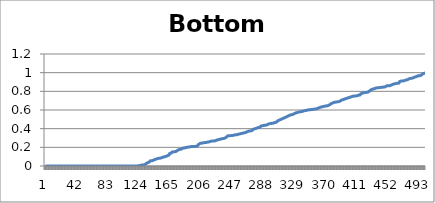
| Category | Bottom Slice |
|---|---|
| 0 | 0 |
| 1 | 0 |
| 2 | 0 |
| 3 | 0 |
| 4 | 0 |
| 5 | 0 |
| 6 | 0 |
| 7 | 0 |
| 8 | 0 |
| 9 | 0 |
| 10 | 0 |
| 11 | 0 |
| 12 | 0 |
| 13 | 0 |
| 14 | 0 |
| 15 | 0 |
| 16 | 0 |
| 17 | 0 |
| 18 | 0 |
| 19 | 0 |
| 20 | 0 |
| 21 | 0 |
| 22 | 0 |
| 23 | 0 |
| 24 | 0 |
| 25 | 0 |
| 26 | 0 |
| 27 | 0 |
| 28 | 0 |
| 29 | 0 |
| 30 | 0 |
| 31 | 0 |
| 32 | 0 |
| 33 | 0 |
| 34 | 0 |
| 35 | 0 |
| 36 | 0 |
| 37 | 0 |
| 38 | 0 |
| 39 | 0 |
| 40 | 0 |
| 41 | 0 |
| 42 | 0 |
| 43 | 0 |
| 44 | 0 |
| 45 | 0 |
| 46 | 0 |
| 47 | 0 |
| 48 | 0 |
| 49 | 0 |
| 50 | 0 |
| 51 | 0 |
| 52 | 0 |
| 53 | 0 |
| 54 | 0 |
| 55 | 0 |
| 56 | 0 |
| 57 | 0 |
| 58 | 0 |
| 59 | 0 |
| 60 | 0 |
| 61 | 0 |
| 62 | 0 |
| 63 | 0 |
| 64 | 0 |
| 65 | 0 |
| 66 | 0 |
| 67 | 0 |
| 68 | 0 |
| 69 | 0 |
| 70 | 0 |
| 71 | 0 |
| 72 | 0 |
| 73 | 0 |
| 74 | 0 |
| 75 | 0 |
| 76 | 0 |
| 77 | 0 |
| 78 | 0 |
| 79 | 0 |
| 80 | 0 |
| 81 | 0 |
| 82 | 0 |
| 83 | 0 |
| 84 | 0 |
| 85 | 0 |
| 86 | 0 |
| 87 | 0 |
| 88 | 0 |
| 89 | 0 |
| 90 | 0 |
| 91 | 0 |
| 92 | 0 |
| 93 | 0 |
| 94 | 0 |
| 95 | 0 |
| 96 | 0 |
| 97 | 0 |
| 98 | 0 |
| 99 | 0 |
| 100 | 0 |
| 101 | 0 |
| 102 | 0 |
| 103 | 0 |
| 104 | 0 |
| 105 | 0 |
| 106 | 0 |
| 107 | 0 |
| 108 | 0 |
| 109 | 0 |
| 110 | 0 |
| 111 | 0 |
| 112 | 0 |
| 113 | 0 |
| 114 | 0 |
| 115 | 0 |
| 116 | 0 |
| 117 | 0 |
| 118 | 0 |
| 119 | 0 |
| 120 | 0 |
| 121 | 0 |
| 122 | 0.002 |
| 123 | 0.004 |
| 124 | 0.005 |
| 125 | 0.007 |
| 126 | 0.01 |
| 127 | 0.01 |
| 128 | 0.01 |
| 129 | 0.012 |
| 130 | 0.014 |
| 131 | 0.019 |
| 132 | 0.024 |
| 133 | 0.033 |
| 134 | 0.035 |
| 135 | 0.038 |
| 136 | 0.041 |
| 137 | 0.043 |
| 138 | 0.056 |
| 139 | 0.056 |
| 140 | 0.056 |
| 141 | 0.059 |
| 142 | 0.062 |
| 143 | 0.07 |
| 144 | 0.071 |
| 145 | 0.074 |
| 146 | 0.076 |
| 147 | 0.079 |
| 148 | 0.082 |
| 149 | 0.082 |
| 150 | 0.083 |
| 151 | 0.085 |
| 152 | 0.087 |
| 153 | 0.091 |
| 154 | 0.095 |
| 155 | 0.096 |
| 156 | 0.098 |
| 157 | 0.1 |
| 158 | 0.102 |
| 159 | 0.106 |
| 160 | 0.11 |
| 161 | 0.116 |
| 162 | 0.116 |
| 163 | 0.133 |
| 164 | 0.135 |
| 165 | 0.137 |
| 166 | 0.149 |
| 167 | 0.15 |
| 168 | 0.151 |
| 169 | 0.152 |
| 170 | 0.153 |
| 171 | 0.155 |
| 172 | 0.158 |
| 173 | 0.166 |
| 174 | 0.17 |
| 175 | 0.177 |
| 176 | 0.178 |
| 177 | 0.179 |
| 178 | 0.179 |
| 179 | 0.189 |
| 180 | 0.19 |
| 181 | 0.191 |
| 182 | 0.193 |
| 183 | 0.196 |
| 184 | 0.196 |
| 185 | 0.198 |
| 186 | 0.201 |
| 187 | 0.203 |
| 188 | 0.203 |
| 189 | 0.204 |
| 190 | 0.205 |
| 191 | 0.207 |
| 192 | 0.209 |
| 193 | 0.209 |
| 194 | 0.21 |
| 195 | 0.21 |
| 196 | 0.21 |
| 197 | 0.21 |
| 198 | 0.211 |
| 199 | 0.219 |
| 200 | 0.219 |
| 201 | 0.231 |
| 202 | 0.231 |
| 203 | 0.242 |
| 204 | 0.243 |
| 205 | 0.245 |
| 206 | 0.246 |
| 207 | 0.248 |
| 208 | 0.248 |
| 209 | 0.25 |
| 210 | 0.251 |
| 211 | 0.252 |
| 212 | 0.254 |
| 213 | 0.257 |
| 214 | 0.258 |
| 215 | 0.259 |
| 216 | 0.263 |
| 217 | 0.265 |
| 218 | 0.267 |
| 219 | 0.268 |
| 220 | 0.268 |
| 221 | 0.269 |
| 222 | 0.269 |
| 223 | 0.27 |
| 224 | 0.275 |
| 225 | 0.278 |
| 226 | 0.281 |
| 227 | 0.282 |
| 228 | 0.283 |
| 229 | 0.286 |
| 230 | 0.29 |
| 231 | 0.291 |
| 232 | 0.294 |
| 233 | 0.294 |
| 234 | 0.296 |
| 235 | 0.297 |
| 236 | 0.301 |
| 237 | 0.306 |
| 238 | 0.31 |
| 239 | 0.322 |
| 240 | 0.323 |
| 241 | 0.325 |
| 242 | 0.325 |
| 243 | 0.325 |
| 244 | 0.326 |
| 245 | 0.327 |
| 246 | 0.329 |
| 247 | 0.329 |
| 248 | 0.332 |
| 249 | 0.334 |
| 250 | 0.334 |
| 251 | 0.334 |
| 252 | 0.335 |
| 253 | 0.34 |
| 254 | 0.342 |
| 255 | 0.344 |
| 256 | 0.344 |
| 257 | 0.348 |
| 258 | 0.351 |
| 259 | 0.351 |
| 260 | 0.352 |
| 261 | 0.356 |
| 262 | 0.357 |
| 263 | 0.359 |
| 264 | 0.364 |
| 265 | 0.368 |
| 266 | 0.368 |
| 267 | 0.375 |
| 268 | 0.375 |
| 269 | 0.376 |
| 270 | 0.379 |
| 271 | 0.379 |
| 272 | 0.381 |
| 273 | 0.394 |
| 274 | 0.398 |
| 275 | 0.399 |
| 276 | 0.401 |
| 277 | 0.404 |
| 278 | 0.411 |
| 279 | 0.412 |
| 280 | 0.413 |
| 281 | 0.414 |
| 282 | 0.415 |
| 283 | 0.429 |
| 284 | 0.43 |
| 285 | 0.431 |
| 286 | 0.435 |
| 287 | 0.435 |
| 288 | 0.436 |
| 289 | 0.437 |
| 290 | 0.438 |
| 291 | 0.442 |
| 292 | 0.448 |
| 293 | 0.45 |
| 294 | 0.451 |
| 295 | 0.454 |
| 296 | 0.455 |
| 297 | 0.457 |
| 298 | 0.457 |
| 299 | 0.459 |
| 300 | 0.466 |
| 301 | 0.467 |
| 302 | 0.467 |
| 303 | 0.468 |
| 304 | 0.477 |
| 305 | 0.484 |
| 306 | 0.489 |
| 307 | 0.492 |
| 308 | 0.493 |
| 309 | 0.499 |
| 310 | 0.504 |
| 311 | 0.507 |
| 312 | 0.509 |
| 313 | 0.515 |
| 314 | 0.517 |
| 315 | 0.521 |
| 316 | 0.525 |
| 317 | 0.529 |
| 318 | 0.529 |
| 319 | 0.537 |
| 320 | 0.538 |
| 321 | 0.546 |
| 322 | 0.546 |
| 323 | 0.549 |
| 324 | 0.55 |
| 325 | 0.554 |
| 326 | 0.561 |
| 327 | 0.563 |
| 328 | 0.568 |
| 329 | 0.57 |
| 330 | 0.57 |
| 331 | 0.574 |
| 332 | 0.578 |
| 333 | 0.579 |
| 334 | 0.581 |
| 335 | 0.582 |
| 336 | 0.584 |
| 337 | 0.584 |
| 338 | 0.586 |
| 339 | 0.59 |
| 340 | 0.592 |
| 341 | 0.594 |
| 342 | 0.594 |
| 343 | 0.596 |
| 344 | 0.6 |
| 345 | 0.601 |
| 346 | 0.602 |
| 347 | 0.602 |
| 348 | 0.603 |
| 349 | 0.605 |
| 350 | 0.606 |
| 351 | 0.607 |
| 352 | 0.607 |
| 353 | 0.61 |
| 354 | 0.61 |
| 355 | 0.61 |
| 356 | 0.612 |
| 357 | 0.617 |
| 358 | 0.618 |
| 359 | 0.623 |
| 360 | 0.628 |
| 361 | 0.63 |
| 362 | 0.633 |
| 363 | 0.634 |
| 364 | 0.636 |
| 365 | 0.637 |
| 366 | 0.64 |
| 367 | 0.642 |
| 368 | 0.644 |
| 369 | 0.644 |
| 370 | 0.648 |
| 371 | 0.648 |
| 372 | 0.649 |
| 373 | 0.655 |
| 374 | 0.658 |
| 375 | 0.668 |
| 376 | 0.673 |
| 377 | 0.675 |
| 378 | 0.676 |
| 379 | 0.683 |
| 380 | 0.684 |
| 381 | 0.684 |
| 382 | 0.686 |
| 383 | 0.688 |
| 384 | 0.688 |
| 385 | 0.69 |
| 386 | 0.695 |
| 387 | 0.696 |
| 388 | 0.7 |
| 389 | 0.708 |
| 390 | 0.71 |
| 391 | 0.711 |
| 392 | 0.713 |
| 393 | 0.719 |
| 394 | 0.722 |
| 395 | 0.723 |
| 396 | 0.723 |
| 397 | 0.731 |
| 398 | 0.733 |
| 399 | 0.734 |
| 400 | 0.735 |
| 401 | 0.74 |
| 402 | 0.742 |
| 403 | 0.746 |
| 404 | 0.747 |
| 405 | 0.75 |
| 406 | 0.75 |
| 407 | 0.751 |
| 408 | 0.752 |
| 409 | 0.752 |
| 410 | 0.755 |
| 411 | 0.759 |
| 412 | 0.761 |
| 413 | 0.762 |
| 414 | 0.774 |
| 415 | 0.774 |
| 416 | 0.781 |
| 417 | 0.784 |
| 418 | 0.785 |
| 419 | 0.787 |
| 420 | 0.787 |
| 421 | 0.788 |
| 422 | 0.79 |
| 423 | 0.792 |
| 424 | 0.794 |
| 425 | 0.795 |
| 426 | 0.808 |
| 427 | 0.815 |
| 428 | 0.819 |
| 429 | 0.822 |
| 430 | 0.825 |
| 431 | 0.825 |
| 432 | 0.829 |
| 433 | 0.831 |
| 434 | 0.837 |
| 435 | 0.837 |
| 436 | 0.838 |
| 437 | 0.839 |
| 438 | 0.84 |
| 439 | 0.841 |
| 440 | 0.841 |
| 441 | 0.844 |
| 442 | 0.844 |
| 443 | 0.844 |
| 444 | 0.845 |
| 445 | 0.847 |
| 446 | 0.849 |
| 447 | 0.851 |
| 448 | 0.859 |
| 449 | 0.859 |
| 450 | 0.86 |
| 451 | 0.86 |
| 452 | 0.861 |
| 453 | 0.868 |
| 454 | 0.868 |
| 455 | 0.869 |
| 456 | 0.875 |
| 457 | 0.879 |
| 458 | 0.88 |
| 459 | 0.882 |
| 460 | 0.884 |
| 461 | 0.887 |
| 462 | 0.887 |
| 463 | 0.887 |
| 464 | 0.889 |
| 465 | 0.905 |
| 466 | 0.907 |
| 467 | 0.911 |
| 468 | 0.911 |
| 469 | 0.911 |
| 470 | 0.913 |
| 471 | 0.914 |
| 472 | 0.916 |
| 473 | 0.921 |
| 474 | 0.923 |
| 475 | 0.923 |
| 476 | 0.927 |
| 477 | 0.933 |
| 478 | 0.936 |
| 479 | 0.938 |
| 480 | 0.94 |
| 481 | 0.941 |
| 482 | 0.946 |
| 483 | 0.946 |
| 484 | 0.951 |
| 485 | 0.954 |
| 486 | 0.956 |
| 487 | 0.958 |
| 488 | 0.964 |
| 489 | 0.967 |
| 490 | 0.967 |
| 491 | 0.968 |
| 492 | 0.969 |
| 493 | 0.972 |
| 494 | 0.982 |
| 495 | 0.987 |
| 496 | 0.988 |
| 497 | 0.993 |
| 498 | 0.993 |
| 499 | 0.998 |